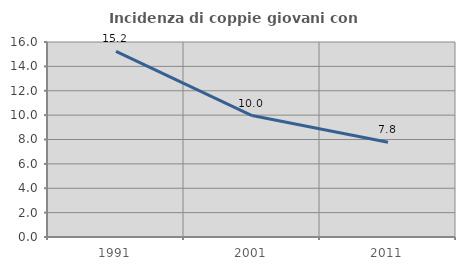
| Category | Incidenza di coppie giovani con figli |
|---|---|
| 1991.0 | 15.234 |
| 2001.0 | 9.962 |
| 2011.0 | 7.77 |